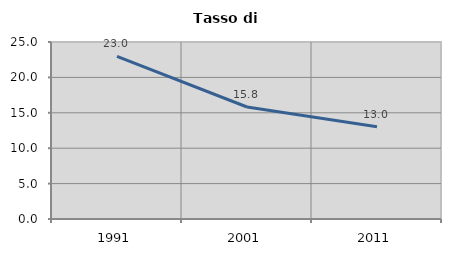
| Category | Tasso di disoccupazione   |
|---|---|
| 1991.0 | 22.968 |
| 2001.0 | 15.817 |
| 2011.0 | 13.021 |